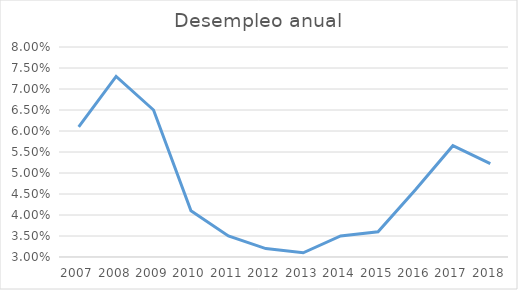
| Category | % del total de fuerza laboral |
|---|---|
| 2007.0 | 0.061 |
| 2008.0 | 0.073 |
| 2009.0 | 0.065 |
| 2010.0 | 0.041 |
| 2011.0 | 0.035 |
| 2012.0 | 0.032 |
| 2013.0 | 0.031 |
| 2014.0 | 0.035 |
| 2015.0 | 0.036 |
| 2016.0 | 0.046 |
| 2017.0 | 0.056 |
| 2018.0 | 0.052 |